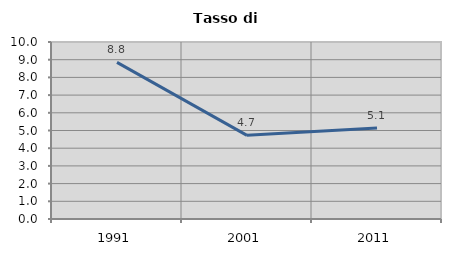
| Category | Tasso di disoccupazione   |
|---|---|
| 1991.0 | 8.849 |
| 2001.0 | 4.726 |
| 2011.0 | 5.138 |